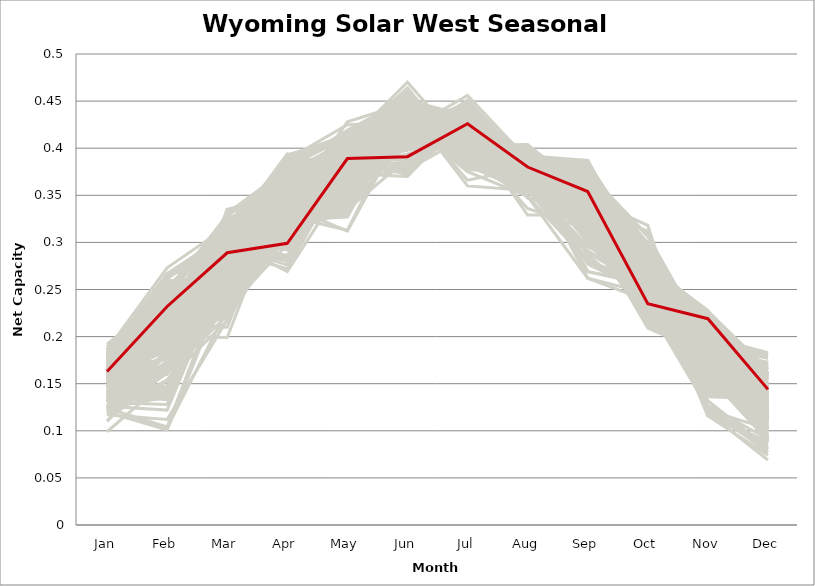
| Category | sample_001 | sample_002 | sample_003 | sample_004 | sample_005 | sample_006 | sample_007 | sample_008 | sample_009 | sample_010 | sample_011 | sample_012 | sample_013 | sample_014 | sample_015 | sample_016 | sample_017 | sample_018 | sample_019 | sample_020 | sample_021 | sample_022 | sample_023 | sample_024 | sample_025 | sample_026 | sample_027 | sample_028 | sample_029 | sample_030 | sample_031 | sample_032 | sample_033 | sample_034 | sample_035 | sample_036 | sample_037 | sample_038 | sample_039 | sample_040 | sample_041 | sample_042 | sample_043 | sample_044 | sample_045 | sample_046 | sample_047 | sample_048 | sample_049 | sample_050 | sample_051 | sample_052 | sample_053 | sample_054 | sample_055 | sample_056 | sample_057 | sample_058 | sample_059 | sample_060 | sample_061 | sample_062 | sample_063 | sample_064 | sample_065 | sample_066 | sample_067 | sample_068 | sample_069 | sample_070 | sample_071 | sample_072 | sample_073 | sample_074 | sample_075 | sample_076 | sample_077 | sample_078 | sample_079 | sample_080 | sample_081 | sample_082 | sample_083 | sample_084 | sample_085 | sample_086 | sample_087 | sample_088 | sample_089 | sample_090 | sample_091 | sample_092 | sample_093 | sample_094 | sample_095 | sample_096 | sample_097 | sample_098 | sample_099 | sample_100 | sample_101 | sample_102 | sample_103 | sample_104 | sample_105 | sample_106 | sample_107 | sample_108 | sample_109 | sample_110 | sample_111 | sample_112 | sample_113 | sample_114 | sample_115 | sample_116 | sample_117 | sample_118 | sample_119 | sample_120 | sample_121 | sample_122 | sample_123 | sample_124 | sample_125 | sample_126 | sample_127 | sample_128 | sample_129 | sample_130 | sample_131 | sample_132 | sample_133 | sample_134 | sample_135 | sample_136 | sample_137 | sample_138 | sample_139 | sample_140 | sample_141 | sample_142 | sample_143 | sample_144 | sample_146 | sample_147 | sample_148 | sample_149 | sample_150 | sample_151 | sample_152 | sample_153 | sample_154 | sample_155 | sample_156 | sample_157 | sample_158 | sample_159 | sample_160 | sample_161 | sample_162 | sample_163 | sample_164 | sample_165 | sample_166 | sample_167 | sample_168 | sample_169 | sample_170 | sample_171 | sample_172 | sample_173 | sample_174 | sample_175 | sample_176 | sample_177 | sample_178 | sample_179 | sample_180 | sample_181 | sample_182 | sample_183 | sample_184 | sample_185 | sample_186 | sample_187 | sample_188 | sample_189 | sample_190 | sample_191 | sample_192 | sample_193 | sample_194 | sample_195 | sample_196 | sample_197 | sample_198 | sample_199 | sample_200 | sample_201 | sample_202 | sample_203 | sample_204 | sample_205 | sample_206 | sample_207 | sample_208 | sample_209 | sample_210 | sample_211 | sample_212 | sample_213 | sample_214 | sample_215 | sample_216 | sample_217 | sample_218 | sample_219 | sample_220 | sample_221 | sample_222 | sample_223 | sample_224 | sample_225 | sample_226 | sample_227 | sample_228 | sample_229 | sample_230 | sample_231 | sample_232 | sample_233 | sample_234 | sample_235 | sample_236 | sample_237 | sample_238 | sample_239 | sample_240 | sample_241 | sample_242 | sample_243 | sample_244 | sample_245 | sample_246 | sample_247 | sample_248 | sample_249 | sample_250 | sample_145 |
|---|---|---|---|---|---|---|---|---|---|---|---|---|---|---|---|---|---|---|---|---|---|---|---|---|---|---|---|---|---|---|---|---|---|---|---|---|---|---|---|---|---|---|---|---|---|---|---|---|---|---|---|---|---|---|---|---|---|---|---|---|---|---|---|---|---|---|---|---|---|---|---|---|---|---|---|---|---|---|---|---|---|---|---|---|---|---|---|---|---|---|---|---|---|---|---|---|---|---|---|---|---|---|---|---|---|---|---|---|---|---|---|---|---|---|---|---|---|---|---|---|---|---|---|---|---|---|---|---|---|---|---|---|---|---|---|---|---|---|---|---|---|---|---|---|---|---|---|---|---|---|---|---|---|---|---|---|---|---|---|---|---|---|---|---|---|---|---|---|---|---|---|---|---|---|---|---|---|---|---|---|---|---|---|---|---|---|---|---|---|---|---|---|---|---|---|---|---|---|---|---|---|---|---|---|---|---|---|---|---|---|---|---|---|---|---|---|---|---|---|---|---|---|---|---|---|---|---|---|---|---|---|---|---|---|---|---|---|---|---|---|---|---|---|---|---|---|---|---|---|---|
| Jan | 0.148 | 0.162 | 0.167 | 0.189 | 0.181 | 0.18 | 0.154 | 0.164 | 0.169 | 0.111 | 0.157 | 0.176 | 0.164 | 0.164 | 0.177 | 0.179 | 0.148 | 0.186 | 0.165 | 0.141 | 0.134 | 0.157 | 0.168 | 0.156 | 0.152 | 0.152 | 0.16 | 0.175 | 0.179 | 0.15 | 0.137 | 0.184 | 0.119 | 0.126 | 0.139 | 0.174 | 0.171 | 0.176 | 0.146 | 0.178 | 0.162 | 0.163 | 0.183 | 0.182 | 0.168 | 0.147 | 0.178 | 0.173 | 0.12 | 0.148 | 0.16 | 0.153 | 0.189 | 0.167 | 0.171 | 0.183 | 0.186 | 0.155 | 0.164 | 0.18 | 0.12 | 0.155 | 0.168 | 0.146 | 0.156 | 0.124 | 0.11 | 0.178 | 0.162 | 0.171 | 0.14 | 0.152 | 0.156 | 0.133 | 0.163 | 0.166 | 0.131 | 0.172 | 0.164 | 0.132 | 0.179 | 0.153 | 0.188 | 0.165 | 0.185 | 0.169 | 0.121 | 0.186 | 0.146 | 0.179 | 0.158 | 0.172 | 0.174 | 0.166 | 0.172 | 0.158 | 0.171 | 0.131 | 0.179 | 0.144 | 0.099 | 0.146 | 0.145 | 0.177 | 0.164 | 0.16 | 0.147 | 0.14 | 0.117 | 0.192 | 0.157 | 0.169 | 0.173 | 0.167 | 0.177 | 0.131 | 0.173 | 0.15 | 0.185 | 0.125 | 0.152 | 0.139 | 0.186 | 0.146 | 0.18 | 0.166 | 0.16 | 0.139 | 0.143 | 0.157 | 0.176 | 0.12 | 0.147 | 0.161 | 0.155 | 0.139 | 0.161 | 0.138 | 0.124 | 0.159 | 0.137 | 0.153 | 0.167 | 0.181 | 0.16 | 0.175 | 0.133 | 0.173 | 0.158 | 0.174 | 0.154 | 0.16 | 0.147 | 0.182 | 0.151 | 0.141 | 0.157 | 0.17 | 0.174 | 0.155 | 0.181 | 0.163 | 0.154 | 0.185 | 0.168 | 0.188 | 0.173 | 0.181 | 0.184 | 0.123 | 0.141 | 0.139 | 0.181 | 0.133 | 0.124 | 0.168 | 0.151 | 0.152 | 0.139 | 0.167 | 0.145 | 0.14 | 0.135 | 0.165 | 0.154 | 0.18 | 0.177 | 0.166 | 0.188 | 0.145 | 0.155 | 0.146 | 0.137 | 0.171 | 0.17 | 0.18 | 0.174 | 0.16 | 0.167 | 0.132 | 0.126 | 0.184 | 0.176 | 0.178 | 0.156 | 0.134 | 0.172 | 0.176 | 0.152 | 0.173 | 0.132 | 0.154 | 0.13 | 0.169 | 0.155 | 0.175 | 0.124 | 0.162 | 0.162 | 0.174 | 0.172 | 0.152 | 0.166 | 0.164 | 0.161 | 0.13 | 0.171 | 0.163 | 0.157 | 0.168 | 0.118 | 0.122 | 0.135 | 0.159 | 0.148 | 0.167 | 0.185 | 0.13 | 0.171 | 0.168 | 0.131 | 0.182 | 0.173 | 0.125 | 0.153 | 0.167 | 0.18 | 0.161 | 0.163 | 0.163 |
| Feb | 0.179 | 0.161 | 0.254 | 0.242 | 0.24 | 0.199 | 0.211 | 0.216 | 0.21 | 0.162 | 0.244 | 0.228 | 0.227 | 0.259 | 0.214 | 0.235 | 0.171 | 0.221 | 0.204 | 0.222 | 0.143 | 0.21 | 0.233 | 0.187 | 0.2 | 0.221 | 0.206 | 0.228 | 0.239 | 0.243 | 0.137 | 0.193 | 0.103 | 0.214 | 0.145 | 0.23 | 0.224 | 0.235 | 0.203 | 0.247 | 0.201 | 0.197 | 0.239 | 0.267 | 0.256 | 0.208 | 0.214 | 0.22 | 0.168 | 0.133 | 0.219 | 0.216 | 0.21 | 0.221 | 0.261 | 0.241 | 0.23 | 0.219 | 0.205 | 0.181 | 0.101 | 0.239 | 0.222 | 0.208 | 0.189 | 0.209 | 0.175 | 0.262 | 0.245 | 0.232 | 0.221 | 0.211 | 0.206 | 0.184 | 0.145 | 0.247 | 0.171 | 0.212 | 0.2 | 0.134 | 0.212 | 0.201 | 0.239 | 0.215 | 0.198 | 0.218 | 0.161 | 0.236 | 0.223 | 0.192 | 0.202 | 0.214 | 0.228 | 0.222 | 0.218 | 0.219 | 0.202 | 0.183 | 0.227 | 0.14 | 0.154 | 0.235 | 0.238 | 0.183 | 0.2 | 0.209 | 0.192 | 0.147 | 0.112 | 0.243 | 0.19 | 0.208 | 0.233 | 0.216 | 0.224 | 0.142 | 0.182 | 0.206 | 0.194 | 0.217 | 0.238 | 0.139 | 0.273 | 0.163 | 0.225 | 0.225 | 0.211 | 0.139 | 0.221 | 0.227 | 0.21 | 0.154 | 0.221 | 0.195 | 0.205 | 0.225 | 0.214 | 0.212 | 0.136 | 0.23 | 0.144 | 0.203 | 0.202 | 0.23 | 0.16 | 0.198 | 0.215 | 0.267 | 0.198 | 0.233 | 0.203 | 0.252 | 0.218 | 0.214 | 0.236 | 0.205 | 0.206 | 0.204 | 0.207 | 0.241 | 0.252 | 0.232 | 0.214 | 0.195 | 0.236 | 0.199 | 0.237 | 0.23 | 0.222 | 0.174 | 0.138 | 0.14 | 0.188 | 0.162 | 0.18 | 0.201 | 0.241 | 0.139 | 0.133 | 0.216 | 0.147 | 0.144 | 0.21 | 0.188 | 0.208 | 0.205 | 0.225 | 0.194 | 0.204 | 0.171 | 0.179 | 0.214 | 0.201 | 0.263 | 0.224 | 0.263 | 0.233 | 0.204 | 0.176 | 0.136 | 0.122 | 0.196 | 0.196 | 0.264 | 0.197 | 0.218 | 0.229 | 0.202 | 0.198 | 0.224 | 0.144 | 0.186 | 0.139 | 0.199 | 0.208 | 0.192 | 0.104 | 0.214 | 0.189 | 0.259 | 0.23 | 0.24 | 0.197 | 0.217 | 0.203 | 0.218 | 0.203 | 0.225 | 0.185 | 0.257 | 0.153 | 0.161 | 0.197 | 0.203 | 0.168 | 0.203 | 0.247 | 0.128 | 0.218 | 0.216 | 0.22 | 0.263 | 0.188 | 0.181 | 0.2 | 0.204 | 0.204 | 0.165 | 0.255 | 0.232 |
| Mar | 0.284 | 0.334 | 0.268 | 0.278 | 0.328 | 0.255 | 0.284 | 0.313 | 0.297 | 0.222 | 0.274 | 0.29 | 0.294 | 0.26 | 0.314 | 0.282 | 0.235 | 0.294 | 0.303 | 0.268 | 0.304 | 0.283 | 0.285 | 0.324 | 0.31 | 0.316 | 0.242 | 0.315 | 0.286 | 0.26 | 0.274 | 0.297 | 0.229 | 0.298 | 0.325 | 0.294 | 0.282 | 0.281 | 0.316 | 0.319 | 0.238 | 0.316 | 0.296 | 0.309 | 0.269 | 0.283 | 0.315 | 0.307 | 0.23 | 0.325 | 0.289 | 0.286 | 0.311 | 0.328 | 0.308 | 0.323 | 0.317 | 0.295 | 0.308 | 0.284 | 0.26 | 0.286 | 0.28 | 0.283 | 0.285 | 0.289 | 0.228 | 0.305 | 0.293 | 0.319 | 0.289 | 0.284 | 0.247 | 0.252 | 0.335 | 0.281 | 0.244 | 0.31 | 0.298 | 0.271 | 0.318 | 0.294 | 0.292 | 0.311 | 0.309 | 0.314 | 0.244 | 0.292 | 0.296 | 0.31 | 0.236 | 0.294 | 0.281 | 0.271 | 0.322 | 0.289 | 0.312 | 0.252 | 0.331 | 0.316 | 0.217 | 0.238 | 0.262 | 0.308 | 0.237 | 0.225 | 0.278 | 0.325 | 0.218 | 0.318 | 0.277 | 0.308 | 0.313 | 0.31 | 0.274 | 0.289 | 0.287 | 0.22 | 0.302 | 0.286 | 0.264 | 0.319 | 0.317 | 0.332 | 0.274 | 0.284 | 0.309 | 0.322 | 0.291 | 0.303 | 0.316 | 0.239 | 0.253 | 0.32 | 0.232 | 0.229 | 0.281 | 0.21 | 0.264 | 0.302 | 0.322 | 0.319 | 0.236 | 0.318 | 0.27 | 0.249 | 0.295 | 0.273 | 0.277 | 0.287 | 0.29 | 0.268 | 0.313 | 0.324 | 0.242 | 0.26 | 0.316 | 0.238 | 0.247 | 0.291 | 0.317 | 0.288 | 0.321 | 0.309 | 0.29 | 0.317 | 0.283 | 0.291 | 0.312 | 0.244 | 0.318 | 0.305 | 0.31 | 0.273 | 0.247 | 0.247 | 0.262 | 0.325 | 0.325 | 0.271 | 0.284 | 0.323 | 0.293 | 0.268 | 0.222 | 0.312 | 0.28 | 0.235 | 0.308 | 0.236 | 0.243 | 0.276 | 0.199 | 0.306 | 0.271 | 0.306 | 0.284 | 0.286 | 0.261 | 0.279 | 0.275 | 0.308 | 0.248 | 0.299 | 0.307 | 0.29 | 0.283 | 0.325 | 0.284 | 0.275 | 0.315 | 0.26 | 0.298 | 0.228 | 0.317 | 0.296 | 0.271 | 0.282 | 0.267 | 0.263 | 0.319 | 0.292 | 0.234 | 0.317 | 0.308 | 0.29 | 0.241 | 0.321 | 0.264 | 0.248 | 0.232 | 0.242 | 0.278 | 0.23 | 0.243 | 0.242 | 0.329 | 0.275 | 0.315 | 0.31 | 0.293 | 0.313 | 0.322 | 0.253 | 0.275 | 0.312 | 0.248 | 0.335 | 0.273 | 0.289 |
| Apr | 0.363 | 0.355 | 0.386 | 0.301 | 0.375 | 0.336 | 0.305 | 0.386 | 0.373 | 0.326 | 0.365 | 0.308 | 0.297 | 0.388 | 0.383 | 0.327 | 0.305 | 0.315 | 0.383 | 0.347 | 0.342 | 0.315 | 0.329 | 0.349 | 0.347 | 0.353 | 0.318 | 0.368 | 0.337 | 0.38 | 0.333 | 0.342 | 0.298 | 0.286 | 0.352 | 0.312 | 0.322 | 0.331 | 0.356 | 0.354 | 0.324 | 0.381 | 0.295 | 0.354 | 0.387 | 0.308 | 0.383 | 0.367 | 0.327 | 0.343 | 0.312 | 0.316 | 0.349 | 0.373 | 0.358 | 0.359 | 0.36 | 0.331 | 0.372 | 0.338 | 0.34 | 0.362 | 0.311 | 0.333 | 0.338 | 0.285 | 0.309 | 0.355 | 0.366 | 0.369 | 0.3 | 0.343 | 0.328 | 0.324 | 0.326 | 0.374 | 0.312 | 0.391 | 0.371 | 0.327 | 0.35 | 0.373 | 0.31 | 0.386 | 0.344 | 0.368 | 0.318 | 0.302 | 0.276 | 0.347 | 0.303 | 0.313 | 0.32 | 0.324 | 0.374 | 0.334 | 0.359 | 0.321 | 0.378 | 0.345 | 0.322 | 0.367 | 0.367 | 0.355 | 0.313 | 0.313 | 0.317 | 0.353 | 0.317 | 0.357 | 0.334 | 0.381 | 0.364 | 0.372 | 0.312 | 0.346 | 0.344 | 0.316 | 0.349 | 0.284 | 0.371 | 0.353 | 0.358 | 0.348 | 0.317 | 0.32 | 0.389 | 0.334 | 0.294 | 0.292 | 0.386 | 0.315 | 0.37 | 0.346 | 0.32 | 0.364 | 0.309 | 0.37 | 0.327 | 0.269 | 0.354 | 0.351 | 0.317 | 0.381 | 0.333 | 0.324 | 0.28 | 0.38 | 0.315 | 0.331 | 0.317 | 0.392 | 0.357 | 0.348 | 0.364 | 0.339 | 0.386 | 0.324 | 0.355 | 0.367 | 0.352 | 0.298 | 0.379 | 0.351 | 0.339 | 0.354 | 0.32 | 0.314 | 0.37 | 0.33 | 0.34 | 0.34 | 0.345 | 0.324 | 0.328 | 0.318 | 0.393 | 0.329 | 0.333 | 0.318 | 0.337 | 0.36 | 0.283 | 0.365 | 0.31 | 0.352 | 0.306 | 0.323 | 0.361 | 0.306 | 0.313 | 0.348 | 0.364 | 0.363 | 0.325 | 0.359 | 0.325 | 0.315 | 0.331 | 0.342 | 0.334 | 0.35 | 0.333 | 0.363 | 0.394 | 0.272 | 0.312 | 0.338 | 0.372 | 0.312 | 0.355 | 0.321 | 0.337 | 0.324 | 0.344 | 0.335 | 0.332 | 0.314 | 0.329 | 0.391 | 0.377 | 0.365 | 0.323 | 0.372 | 0.371 | 0.284 | 0.321 | 0.371 | 0.332 | 0.368 | 0.317 | 0.311 | 0.336 | 0.32 | 0.316 | 0.319 | 0.375 | 0.339 | 0.389 | 0.377 | 0.285 | 0.358 | 0.355 | 0.332 | 0.315 | 0.365 | 0.328 | 0.353 | 0.372 | 0.299 |
| May | 0.382 | 0.375 | 0.408 | 0.378 | 0.36 | 0.334 | 0.352 | 0.39 | 0.361 | 0.365 | 0.404 | 0.341 | 0.388 | 0.425 | 0.374 | 0.356 | 0.372 | 0.385 | 0.383 | 0.417 | 0.373 | 0.345 | 0.359 | 0.396 | 0.391 | 0.378 | 0.353 | 0.348 | 0.357 | 0.412 | 0.385 | 0.402 | 0.395 | 0.395 | 0.385 | 0.344 | 0.362 | 0.361 | 0.365 | 0.409 | 0.341 | 0.36 | 0.381 | 0.389 | 0.412 | 0.351 | 0.373 | 0.398 | 0.395 | 0.389 | 0.342 | 0.348 | 0.398 | 0.369 | 0.379 | 0.401 | 0.391 | 0.415 | 0.366 | 0.382 | 0.402 | 0.399 | 0.36 | 0.406 | 0.367 | 0.389 | 0.357 | 0.393 | 0.404 | 0.365 | 0.388 | 0.375 | 0.355 | 0.402 | 0.375 | 0.408 | 0.385 | 0.354 | 0.365 | 0.384 | 0.38 | 0.376 | 0.364 | 0.379 | 0.411 | 0.356 | 0.375 | 0.377 | 0.383 | 0.401 | 0.346 | 0.348 | 0.359 | 0.36 | 0.367 | 0.406 | 0.378 | 0.401 | 0.36 | 0.388 | 0.369 | 0.404 | 0.411 | 0.406 | 0.345 | 0.346 | 0.349 | 0.39 | 0.4 | 0.39 | 0.376 | 0.381 | 0.409 | 0.391 | 0.385 | 0.372 | 0.392 | 0.351 | 0.395 | 0.383 | 0.41 | 0.398 | 0.385 | 0.378 | 0.353 | 0.357 | 0.378 | 0.392 | 0.388 | 0.382 | 0.377 | 0.385 | 0.401 | 0.382 | 0.361 | 0.406 | 0.353 | 0.409 | 0.385 | 0.368 | 0.384 | 0.368 | 0.331 | 0.372 | 0.36 | 0.33 | 0.382 | 0.419 | 0.333 | 0.363 | 0.362 | 0.414 | 0.385 | 0.378 | 0.404 | 0.312 | 0.369 | 0.332 | 0.342 | 0.393 | 0.405 | 0.387 | 0.384 | 0.405 | 0.369 | 0.407 | 0.362 | 0.346 | 0.369 | 0.411 | 0.384 | 0.374 | 0.395 | 0.376 | 0.412 | 0.346 | 0.411 | 0.379 | 0.392 | 0.36 | 0.374 | 0.387 | 0.377 | 0.366 | 0.346 | 0.402 | 0.389 | 0.339 | 0.415 | 0.382 | 0.363 | 0.419 | 0.398 | 0.396 | 0.36 | 0.379 | 0.364 | 0.331 | 0.335 | 0.385 | 0.403 | 0.409 | 0.339 | 0.4 | 0.368 | 0.385 | 0.398 | 0.37 | 0.361 | 0.393 | 0.39 | 0.348 | 0.371 | 0.327 | 0.376 | 0.406 | 0.396 | 0.339 | 0.349 | 0.412 | 0.355 | 0.411 | 0.335 | 0.379 | 0.379 | 0.373 | 0.335 | 0.373 | 0.361 | 0.399 | 0.378 | 0.387 | 0.428 | 0.353 | 0.377 | 0.334 | 0.358 | 0.381 | 0.387 | 0.389 | 0.384 | 0.386 | 0.413 | 0.406 | 0.343 | 0.384 | 0.313 | 0.376 | 0.409 | 0.389 |
| Jun | 0.457 | 0.404 | 0.441 | 0.394 | 0.422 | 0.434 | 0.426 | 0.446 | 0.416 | 0.408 | 0.453 | 0.416 | 0.388 | 0.427 | 0.438 | 0.433 | 0.424 | 0.409 | 0.438 | 0.453 | 0.428 | 0.423 | 0.427 | 0.445 | 0.432 | 0.412 | 0.422 | 0.403 | 0.424 | 0.451 | 0.419 | 0.463 | 0.444 | 0.372 | 0.406 | 0.42 | 0.43 | 0.428 | 0.425 | 0.453 | 0.43 | 0.418 | 0.398 | 0.45 | 0.442 | 0.424 | 0.435 | 0.445 | 0.419 | 0.41 | 0.422 | 0.42 | 0.445 | 0.419 | 0.431 | 0.454 | 0.444 | 0.448 | 0.413 | 0.459 | 0.451 | 0.416 | 0.421 | 0.449 | 0.442 | 0.372 | 0.405 | 0.452 | 0.428 | 0.415 | 0.382 | 0.43 | 0.435 | 0.429 | 0.407 | 0.451 | 0.414 | 0.414 | 0.41 | 0.426 | 0.435 | 0.408 | 0.403 | 0.436 | 0.454 | 0.408 | 0.426 | 0.408 | 0.373 | 0.459 | 0.411 | 0.421 | 0.429 | 0.427 | 0.416 | 0.446 | 0.436 | 0.43 | 0.431 | 0.413 | 0.408 | 0.442 | 0.455 | 0.464 | 0.415 | 0.424 | 0.415 | 0.406 | 0.44 | 0.447 | 0.443 | 0.436 | 0.449 | 0.441 | 0.405 | 0.424 | 0.461 | 0.419 | 0.457 | 0.392 | 0.45 | 0.408 | 0.447 | 0.407 | 0.425 | 0.437 | 0.417 | 0.408 | 0.381 | 0.392 | 0.437 | 0.425 | 0.452 | 0.431 | 0.422 | 0.439 | 0.423 | 0.444 | 0.425 | 0.377 | 0.405 | 0.41 | 0.44 | 0.44 | 0.403 | 0.443 | 0.385 | 0.437 | 0.413 | 0.431 | 0.424 | 0.44 | 0.414 | 0.438 | 0.442 | 0.428 | 0.415 | 0.444 | 0.424 | 0.433 | 0.457 | 0.389 | 0.416 | 0.452 | 0.43 | 0.456 | 0.433 | 0.433 | 0.432 | 0.425 | 0.407 | 0.431 | 0.443 | 0.417 | 0.424 | 0.439 | 0.44 | 0.417 | 0.411 | 0.423 | 0.419 | 0.408 | 0.377 | 0.417 | 0.412 | 0.454 | 0.406 | 0.439 | 0.453 | 0.418 | 0.421 | 0.453 | 0.444 | 0.433 | 0.43 | 0.44 | 0.434 | 0.413 | 0.389 | 0.425 | 0.458 | 0.458 | 0.441 | 0.451 | 0.406 | 0.378 | 0.406 | 0.426 | 0.405 | 0.398 | 0.4 | 0.426 | 0.421 | 0.443 | 0.414 | 0.47 | 0.445 | 0.417 | 0.427 | 0.43 | 0.429 | 0.419 | 0.439 | 0.419 | 0.408 | 0.37 | 0.441 | 0.422 | 0.444 | 0.427 | 0.413 | 0.421 | 0.448 | 0.419 | 0.422 | 0.432 | 0.426 | 0.427 | 0.437 | 0.441 | 0.376 | 0.447 | 0.461 | 0.431 | 0.409 | 0.434 | 0.439 | 0.403 | 0.452 | 0.391 |
| Jul | 0.412 | 0.395 | 0.393 | 0.412 | 0.419 | 0.376 | 0.416 | 0.408 | 0.428 | 0.447 | 0.392 | 0.389 | 0.415 | 0.392 | 0.408 | 0.407 | 0.401 | 0.406 | 0.415 | 0.404 | 0.401 | 0.421 | 0.409 | 0.414 | 0.427 | 0.448 | 0.396 | 0.424 | 0.405 | 0.389 | 0.394 | 0.381 | 0.415 | 0.437 | 0.41 | 0.397 | 0.411 | 0.403 | 0.446 | 0.382 | 0.392 | 0.424 | 0.409 | 0.424 | 0.39 | 0.423 | 0.409 | 0.394 | 0.439 | 0.404 | 0.42 | 0.419 | 0.387 | 0.414 | 0.434 | 0.381 | 0.391 | 0.391 | 0.433 | 0.378 | 0.411 | 0.45 | 0.417 | 0.404 | 0.383 | 0.436 | 0.451 | 0.428 | 0.446 | 0.414 | 0.425 | 0.386 | 0.4 | 0.422 | 0.402 | 0.378 | 0.436 | 0.417 | 0.428 | 0.404 | 0.407 | 0.433 | 0.41 | 0.412 | 0.38 | 0.428 | 0.435 | 0.409 | 0.427 | 0.38 | 0.392 | 0.41 | 0.409 | 0.418 | 0.419 | 0.39 | 0.411 | 0.421 | 0.418 | 0.411 | 0.451 | 0.41 | 0.397 | 0.385 | 0.395 | 0.397 | 0.441 | 0.409 | 0.425 | 0.389 | 0.388 | 0.411 | 0.391 | 0.399 | 0.418 | 0.395 | 0.386 | 0.401 | 0.382 | 0.423 | 0.392 | 0.407 | 0.425 | 0.393 | 0.397 | 0.414 | 0.425 | 0.408 | 0.428 | 0.416 | 0.409 | 0.434 | 0.401 | 0.42 | 0.399 | 0.409 | 0.424 | 0.403 | 0.4 | 0.413 | 0.407 | 0.443 | 0.389 | 0.396 | 0.421 | 0.381 | 0.426 | 0.386 | 0.418 | 0.403 | 0.425 | 0.395 | 0.448 | 0.405 | 0.401 | 0.388 | 0.428 | 0.389 | 0.401 | 0.44 | 0.382 | 0.423 | 0.424 | 0.385 | 0.409 | 0.38 | 0.407 | 0.394 | 0.413 | 0.425 | 0.408 | 0.397 | 0.36 | 0.397 | 0.423 | 0.394 | 0.39 | 0.399 | 0.413 | 0.416 | 0.397 | 0.407 | 0.431 | 0.406 | 0.403 | 0.38 | 0.418 | 0.395 | 0.39 | 0.412 | 0.394 | 0.397 | 0.402 | 0.43 | 0.415 | 0.431 | 0.415 | 0.429 | 0.421 | 0.4 | 0.408 | 0.38 | 0.381 | 0.434 | 0.424 | 0.422 | 0.426 | 0.41 | 0.433 | 0.425 | 0.412 | 0.388 | 0.407 | 0.39 | 0.448 | 0.397 | 0.416 | 0.427 | 0.375 | 0.388 | 0.429 | 0.456 | 0.401 | 0.424 | 0.427 | 0.436 | 0.388 | 0.418 | 0.385 | 0.398 | 0.444 | 0.442 | 0.408 | 0.398 | 0.412 | 0.38 | 0.417 | 0.401 | 0.405 | 0.398 | 0.427 | 0.428 | 0.381 | 0.427 | 0.435 | 0.416 | 0.366 | 0.405 | 0.379 | 0.426 |
| Aug | 0.356 | 0.372 | 0.373 | 0.373 | 0.362 | 0.389 | 0.39 | 0.378 | 0.378 | 0.378 | 0.371 | 0.372 | 0.375 | 0.381 | 0.367 | 0.388 | 0.362 | 0.371 | 0.376 | 0.372 | 0.374 | 0.389 | 0.396 | 0.382 | 0.376 | 0.373 | 0.398 | 0.386 | 0.393 | 0.374 | 0.365 | 0.376 | 0.391 | 0.394 | 0.367 | 0.379 | 0.391 | 0.392 | 0.372 | 0.353 | 0.392 | 0.382 | 0.37 | 0.375 | 0.378 | 0.39 | 0.37 | 0.372 | 0.373 | 0.373 | 0.388 | 0.389 | 0.364 | 0.367 | 0.384 | 0.36 | 0.369 | 0.384 | 0.381 | 0.384 | 0.385 | 0.383 | 0.383 | 0.387 | 0.355 | 0.382 | 0.383 | 0.374 | 0.384 | 0.368 | 0.38 | 0.349 | 0.394 | 0.37 | 0.371 | 0.369 | 0.366 | 0.379 | 0.373 | 0.37 | 0.37 | 0.382 | 0.368 | 0.374 | 0.369 | 0.378 | 0.37 | 0.371 | 0.381 | 0.373 | 0.403 | 0.382 | 0.385 | 0.389 | 0.364 | 0.392 | 0.38 | 0.365 | 0.359 | 0.38 | 0.384 | 0.383 | 0.367 | 0.384 | 0.396 | 0.403 | 0.393 | 0.362 | 0.39 | 0.368 | 0.364 | 0.373 | 0.375 | 0.378 | 0.377 | 0.37 | 0.386 | 0.402 | 0.369 | 0.388 | 0.377 | 0.379 | 0.377 | 0.376 | 0.383 | 0.394 | 0.375 | 0.371 | 0.383 | 0.386 | 0.367 | 0.366 | 0.384 | 0.373 | 0.398 | 0.377 | 0.388 | 0.394 | 0.373 | 0.383 | 0.361 | 0.372 | 0.389 | 0.371 | 0.347 | 0.38 | 0.385 | 0.382 | 0.39 | 0.388 | 0.386 | 0.381 | 0.376 | 0.38 | 0.383 | 0.378 | 0.384 | 0.387 | 0.397 | 0.391 | 0.354 | 0.376 | 0.374 | 0.36 | 0.396 | 0.363 | 0.394 | 0.384 | 0.374 | 0.37 | 0.377 | 0.373 | 0.355 | 0.376 | 0.36 | 0.391 | 0.377 | 0.373 | 0.378 | 0.389 | 0.369 | 0.363 | 0.381 | 0.336 | 0.404 | 0.366 | 0.371 | 0.388 | 0.364 | 0.361 | 0.359 | 0.37 | 0.4 | 0.386 | 0.392 | 0.377 | 0.388 | 0.388 | 0.329 | 0.373 | 0.395 | 0.371 | 0.391 | 0.372 | 0.389 | 0.386 | 0.379 | 0.375 | 0.377 | 0.371 | 0.368 | 0.357 | 0.375 | 0.387 | 0.377 | 0.383 | 0.385 | 0.39 | 0.349 | 0.383 | 0.362 | 0.388 | 0.394 | 0.37 | 0.365 | 0.378 | 0.39 | 0.371 | 0.365 | 0.382 | 0.379 | 0.373 | 0.394 | 0.397 | 0.366 | 0.387 | 0.366 | 0.372 | 0.374 | 0.38 | 0.388 | 0.377 | 0.377 | 0.355 | 0.39 | 0.377 | 0.379 | 0.36 | 0.37 | 0.38 |
| Sep | 0.316 | 0.319 | 0.313 | 0.343 | 0.319 | 0.345 | 0.381 | 0.323 | 0.342 | 0.341 | 0.334 | 0.375 | 0.354 | 0.277 | 0.322 | 0.368 | 0.288 | 0.343 | 0.322 | 0.328 | 0.323 | 0.377 | 0.364 | 0.338 | 0.331 | 0.359 | 0.359 | 0.346 | 0.357 | 0.326 | 0.33 | 0.331 | 0.357 | 0.364 | 0.318 | 0.377 | 0.376 | 0.355 | 0.373 | 0.315 | 0.363 | 0.333 | 0.351 | 0.337 | 0.314 | 0.376 | 0.325 | 0.325 | 0.335 | 0.304 | 0.379 | 0.377 | 0.326 | 0.33 | 0.345 | 0.329 | 0.331 | 0.323 | 0.341 | 0.334 | 0.338 | 0.341 | 0.382 | 0.329 | 0.282 | 0.36 | 0.347 | 0.328 | 0.339 | 0.335 | 0.36 | 0.262 | 0.364 | 0.334 | 0.311 | 0.328 | 0.352 | 0.332 | 0.335 | 0.34 | 0.331 | 0.34 | 0.347 | 0.315 | 0.327 | 0.336 | 0.352 | 0.346 | 0.357 | 0.351 | 0.345 | 0.383 | 0.37 | 0.384 | 0.339 | 0.322 | 0.335 | 0.334 | 0.315 | 0.303 | 0.336 | 0.269 | 0.321 | 0.358 | 0.357 | 0.353 | 0.378 | 0.307 | 0.352 | 0.331 | 0.291 | 0.32 | 0.331 | 0.326 | 0.343 | 0.332 | 0.329 | 0.359 | 0.338 | 0.356 | 0.33 | 0.306 | 0.331 | 0.318 | 0.371 | 0.376 | 0.343 | 0.304 | 0.363 | 0.362 | 0.318 | 0.347 | 0.269 | 0.328 | 0.359 | 0.311 | 0.383 | 0.314 | 0.334 | 0.367 | 0.315 | 0.367 | 0.36 | 0.324 | 0.333 | 0.357 | 0.357 | 0.302 | 0.375 | 0.362 | 0.385 | 0.305 | 0.363 | 0.339 | 0.262 | 0.345 | 0.332 | 0.355 | 0.339 | 0.34 | 0.321 | 0.354 | 0.334 | 0.332 | 0.359 | 0.324 | 0.368 | 0.367 | 0.329 | 0.33 | 0.3 | 0.318 | 0.325 | 0.343 | 0.339 | 0.363 | 0.304 | 0.318 | 0.313 | 0.387 | 0.341 | 0.308 | 0.36 | 0.314 | 0.351 | 0.345 | 0.344 | 0.362 | 0.328 | 0.296 | 0.289 | 0.333 | 0.323 | 0.336 | 0.387 | 0.333 | 0.372 | 0.374 | 0.329 | 0.338 | 0.346 | 0.335 | 0.345 | 0.333 | 0.329 | 0.359 | 0.343 | 0.341 | 0.334 | 0.341 | 0.308 | 0.279 | 0.322 | 0.357 | 0.372 | 0.348 | 0.347 | 0.374 | 0.28 | 0.286 | 0.321 | 0.349 | 0.365 | 0.327 | 0.34 | 0.356 | 0.357 | 0.333 | 0.289 | 0.278 | 0.348 | 0.355 | 0.318 | 0.352 | 0.295 | 0.355 | 0.325 | 0.335 | 0.316 | 0.322 | 0.364 | 0.34 | 0.352 | 0.347 | 0.374 | 0.333 | 0.349 | 0.317 | 0.329 | 0.354 |
| Oct | 0.253 | 0.209 | 0.243 | 0.226 | 0.251 | 0.244 | 0.29 | 0.272 | 0.292 | 0.3 | 0.248 | 0.271 | 0.223 | 0.246 | 0.27 | 0.26 | 0.261 | 0.225 | 0.277 | 0.253 | 0.233 | 0.292 | 0.256 | 0.28 | 0.282 | 0.28 | 0.271 | 0.278 | 0.266 | 0.243 | 0.247 | 0.242 | 0.29 | 0.243 | 0.218 | 0.274 | 0.269 | 0.262 | 0.285 | 0.271 | 0.274 | 0.276 | 0.222 | 0.23 | 0.24 | 0.294 | 0.271 | 0.266 | 0.269 | 0.22 | 0.291 | 0.29 | 0.226 | 0.257 | 0.244 | 0.265 | 0.265 | 0.261 | 0.28 | 0.258 | 0.25 | 0.251 | 0.273 | 0.27 | 0.247 | 0.271 | 0.318 | 0.237 | 0.255 | 0.251 | 0.224 | 0.238 | 0.269 | 0.246 | 0.221 | 0.228 | 0.264 | 0.269 | 0.286 | 0.257 | 0.273 | 0.287 | 0.23 | 0.276 | 0.23 | 0.277 | 0.279 | 0.229 | 0.245 | 0.233 | 0.289 | 0.283 | 0.257 | 0.271 | 0.255 | 0.27 | 0.277 | 0.246 | 0.245 | 0.234 | 0.312 | 0.257 | 0.243 | 0.239 | 0.269 | 0.276 | 0.299 | 0.216 | 0.29 | 0.259 | 0.254 | 0.279 | 0.262 | 0.27 | 0.235 | 0.224 | 0.255 | 0.275 | 0.233 | 0.264 | 0.243 | 0.228 | 0.23 | 0.213 | 0.265 | 0.264 | 0.268 | 0.221 | 0.225 | 0.23 | 0.271 | 0.267 | 0.255 | 0.278 | 0.269 | 0.245 | 0.29 | 0.273 | 0.271 | 0.228 | 0.224 | 0.29 | 0.264 | 0.268 | 0.277 | 0.253 | 0.258 | 0.243 | 0.306 | 0.261 | 0.285 | 0.242 | 0.28 | 0.272 | 0.246 | 0.253 | 0.275 | 0.259 | 0.243 | 0.254 | 0.272 | 0.232 | 0.259 | 0.228 | 0.264 | 0.227 | 0.263 | 0.259 | 0.269 | 0.257 | 0.231 | 0.224 | 0.222 | 0.265 | 0.233 | 0.249 | 0.244 | 0.222 | 0.223 | 0.274 | 0.235 | 0.221 | 0.269 | 0.263 | 0.293 | 0.225 | 0.232 | 0.265 | 0.223 | 0.269 | 0.252 | 0.261 | 0.273 | 0.24 | 0.269 | 0.241 | 0.263 | 0.307 | 0.278 | 0.24 | 0.25 | 0.235 | 0.241 | 0.227 | 0.278 | 0.253 | 0.229 | 0.275 | 0.295 | 0.234 | 0.22 | 0.259 | 0.233 | 0.269 | 0.283 | 0.252 | 0.254 | 0.299 | 0.249 | 0.238 | 0.259 | 0.256 | 0.272 | 0.254 | 0.264 | 0.276 | 0.247 | 0.249 | 0.256 | 0.263 | 0.29 | 0.269 | 0.272 | 0.281 | 0.265 | 0.265 | 0.256 | 0.251 | 0.268 | 0.27 | 0.255 | 0.237 | 0.236 | 0.232 | 0.307 | 0.277 | 0.26 | 0.213 | 0.235 | 0.235 |
| Nov | 0.154 | 0.181 | 0.165 | 0.214 | 0.168 | 0.182 | 0.175 | 0.193 | 0.19 | 0.127 | 0.184 | 0.177 | 0.22 | 0.168 | 0.213 | 0.144 | 0.188 | 0.2 | 0.204 | 0.176 | 0.178 | 0.178 | 0.137 | 0.214 | 0.221 | 0.183 | 0.192 | 0.182 | 0.141 | 0.167 | 0.176 | 0.179 | 0.213 | 0.214 | 0.176 | 0.179 | 0.152 | 0.14 | 0.186 | 0.167 | 0.187 | 0.171 | 0.222 | 0.175 | 0.175 | 0.178 | 0.208 | 0.188 | 0.116 | 0.181 | 0.183 | 0.177 | 0.162 | 0.172 | 0.182 | 0.179 | 0.194 | 0.195 | 0.188 | 0.191 | 0.161 | 0.176 | 0.176 | 0.189 | 0.165 | 0.2 | 0.122 | 0.169 | 0.176 | 0.167 | 0.22 | 0.15 | 0.188 | 0.123 | 0.188 | 0.18 | 0.12 | 0.173 | 0.193 | 0.176 | 0.221 | 0.186 | 0.209 | 0.196 | 0.153 | 0.187 | 0.118 | 0.208 | 0.227 | 0.168 | 0.195 | 0.177 | 0.154 | 0.167 | 0.172 | 0.188 | 0.21 | 0.132 | 0.164 | 0.18 | 0.116 | 0.162 | 0.176 | 0.173 | 0.2 | 0.195 | 0.19 | 0.179 | 0.201 | 0.186 | 0.184 | 0.211 | 0.174 | 0.192 | 0.196 | 0.172 | 0.19 | 0.192 | 0.183 | 0.203 | 0.169 | 0.172 | 0.176 | 0.173 | 0.174 | 0.143 | 0.159 | 0.18 | 0.224 | 0.218 | 0.21 | 0.119 | 0.169 | 0.226 | 0.185 | 0.164 | 0.173 | 0.151 | 0.173 | 0.227 | 0.174 | 0.192 | 0.188 | 0.197 | 0.183 | 0.187 | 0.22 | 0.175 | 0.193 | 0.144 | 0.171 | 0.164 | 0.18 | 0.222 | 0.166 | 0.182 | 0.168 | 0.179 | 0.167 | 0.169 | 0.165 | 0.221 | 0.16 | 0.156 | 0.136 | 0.158 | 0.138 | 0.147 | 0.211 | 0.119 | 0.181 | 0.178 | 0.158 | 0.179 | 0.126 | 0.186 | 0.156 | 0.181 | 0.179 | 0.167 | 0.181 | 0.171 | 0.21 | 0.157 | 0.191 | 0.162 | 0.198 | 0.186 | 0.149 | 0.194 | 0.182 | 0.185 | 0.159 | 0.18 | 0.163 | 0.176 | 0.147 | 0.194 | 0.162 | 0.176 | 0.164 | 0.155 | 0.18 | 0.158 | 0.161 | 0.218 | 0.199 | 0.228 | 0.192 | 0.206 | 0.172 | 0.18 | 0.175 | 0.181 | 0.194 | 0.178 | 0.168 | 0.19 | 0.179 | 0.17 | 0.158 | 0.179 | 0.186 | 0.158 | 0.162 | 0.211 | 0.179 | 0.166 | 0.178 | 0.162 | 0.119 | 0.116 | 0.182 | 0.193 | 0.19 | 0.192 | 0.173 | 0.168 | 0.189 | 0.189 | 0.216 | 0.172 | 0.171 | 0.124 | 0.192 | 0.213 | 0.192 | 0.185 | 0.176 | 0.219 |
| Dec | 0.11 | 0.137 | 0.13 | 0.158 | 0.097 | 0.179 | 0.127 | 0.12 | 0.122 | 0.091 | 0.146 | 0.134 | 0.142 | 0.123 | 0.126 | 0.134 | 0.14 | 0.149 | 0.106 | 0.141 | 0.146 | 0.124 | 0.143 | 0.114 | 0.116 | 0.15 | 0.172 | 0.114 | 0.142 | 0.136 | 0.156 | 0.111 | 0.094 | 0.147 | 0.129 | 0.138 | 0.129 | 0.14 | 0.147 | 0.124 | 0.168 | 0.102 | 0.158 | 0.16 | 0.141 | 0.125 | 0.117 | 0.122 | 0.074 | 0.137 | 0.132 | 0.127 | 0.133 | 0.099 | 0.149 | 0.127 | 0.136 | 0.156 | 0.111 | 0.12 | 0.094 | 0.129 | 0.128 | 0.146 | 0.136 | 0.158 | 0.102 | 0.153 | 0.13 | 0.105 | 0.144 | 0.138 | 0.165 | 0.083 | 0.152 | 0.144 | 0.086 | 0.102 | 0.122 | 0.158 | 0.121 | 0.111 | 0.155 | 0.121 | 0.13 | 0.113 | 0.088 | 0.154 | 0.161 | 0.111 | 0.182 | 0.129 | 0.136 | 0.124 | 0.1 | 0.161 | 0.116 | 0.081 | 0.093 | 0.138 | 0.086 | 0.106 | 0.136 | 0.108 | 0.183 | 0.182 | 0.123 | 0.124 | 0.089 | 0.138 | 0.131 | 0.115 | 0.126 | 0.118 | 0.147 | 0.15 | 0.113 | 0.18 | 0.112 | 0.155 | 0.134 | 0.132 | 0.16 | 0.132 | 0.14 | 0.134 | 0.092 | 0.142 | 0.146 | 0.157 | 0.111 | 0.081 | 0.101 | 0.12 | 0.172 | 0.131 | 0.12 | 0.14 | 0.153 | 0.165 | 0.12 | 0.155 | 0.171 | 0.132 | 0.121 | 0.17 | 0.16 | 0.131 | 0.133 | 0.14 | 0.118 | 0.123 | 0.143 | 0.123 | 0.103 | 0.124 | 0.09 | 0.171 | 0.172 | 0.129 | 0.128 | 0.142 | 0.089 | 0.123 | 0.134 | 0.125 | 0.136 | 0.141 | 0.121 | 0.069 | 0.139 | 0.15 | 0.118 | 0.166 | 0.08 | 0.17 | 0.125 | 0.147 | 0.138 | 0.125 | 0.151 | 0.127 | 0.162 | 0.122 | 0.179 | 0.119 | 0.147 | 0.168 | 0.13 | 0.137 | 0.14 | 0.143 | 0.141 | 0.15 | 0.124 | 0.156 | 0.135 | 0.131 | 0.113 | 0.146 | 0.102 | 0.125 | 0.173 | 0.136 | 0.095 | 0.167 | 0.142 | 0.133 | 0.118 | 0.139 | 0.128 | 0.13 | 0.147 | 0.17 | 0.16 | 0.113 | 0.102 | 0.121 | 0.127 | 0.129 | 0.091 | 0.129 | 0.17 | 0.092 | 0.092 | 0.16 | 0.171 | 0.104 | 0.13 | 0.103 | 0.087 | 0.088 | 0.149 | 0.181 | 0.139 | 0.177 | 0.103 | 0.153 | 0.116 | 0.113 | 0.16 | 0.158 | 0.109 | 0.077 | 0.127 | 0.117 | 0.177 | 0.139 | 0.147 | 0.144 |